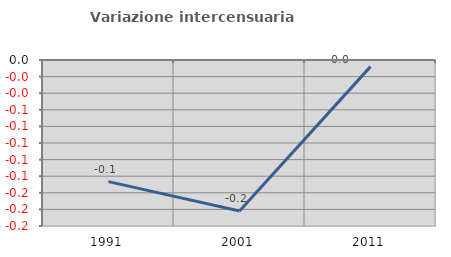
| Category | Variazione intercensuaria annua |
|---|---|
| 1991.0 | -0.147 |
| 2001.0 | -0.182 |
| 2011.0 | -0.008 |